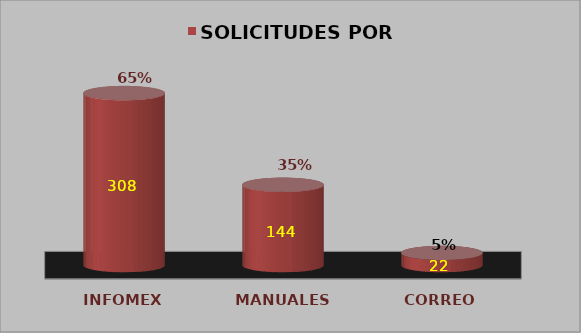
| Category | SOLICITUDES POR TIPO |
|---|---|
| INFOMEX | 0.65 |
| MANUALES | 0.304 |
| CORREO | 0.046 |